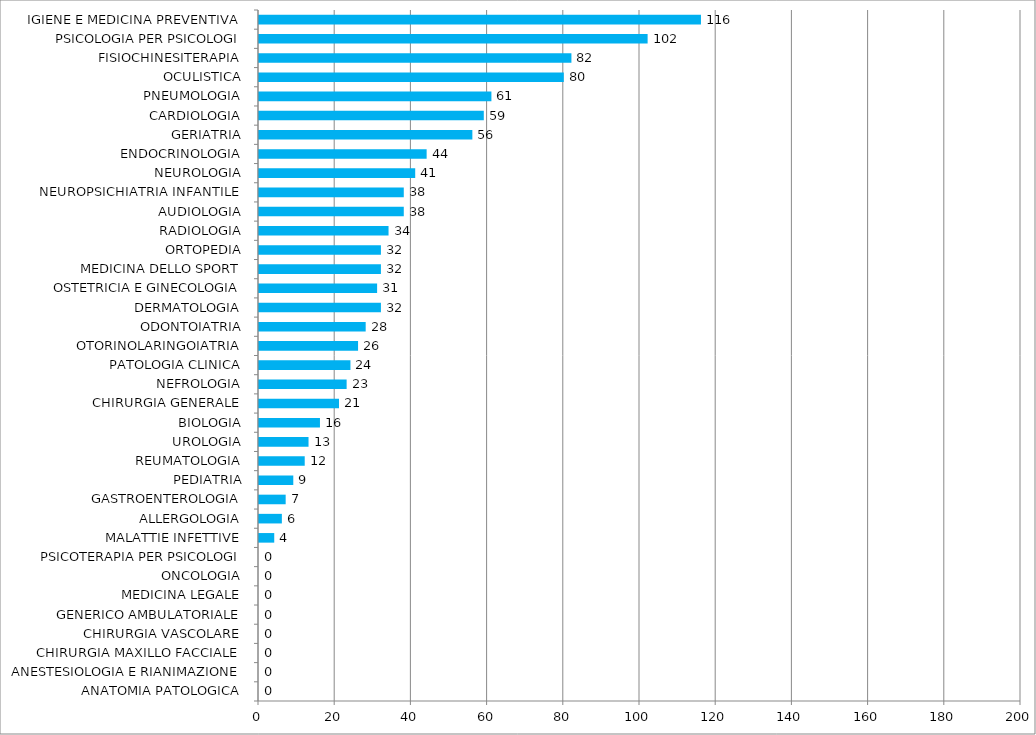
| Category | Series 0 |
|---|---|
| ANATOMIA PATOLOGICA | 0 |
| ANESTESIOLOGIA E RIANIMAZIONE | 0 |
| CHIRURGIA MAXILLO FACCIALE | 0 |
| CHIRURGIA VASCOLARE | 0 |
| GENERICO AMBULATORIALE | 0 |
| MEDICINA LEGALE | 0 |
| ONCOLOGIA | 0 |
| PSICOTERAPIA PER PSICOLOGI | 0 |
| MALATTIE INFETTIVE | 4 |
| ALLERGOLOGIA | 6 |
| GASTROENTEROLOGIA | 7 |
| PEDIATRIA | 9 |
| REUMATOLOGIA | 12 |
| UROLOGIA | 13 |
| BIOLOGIA | 16 |
| CHIRURGIA GENERALE | 21 |
| NEFROLOGIA | 23 |
| PATOLOGIA CLINICA | 24 |
| OTORINOLARINGOIATRIA | 26 |
| ODONTOIATRIA | 28 |
| DERMATOLOGIA | 32 |
| OSTETRICIA E GINECOLOGIA | 31 |
| MEDICINA DELLO SPORT | 32 |
| ORTOPEDIA | 32 |
| RADIOLOGIA | 34 |
| AUDIOLOGIA | 38 |
| NEUROPSICHIATRIA INFANTILE | 38 |
| NEUROLOGIA | 41 |
| ENDOCRINOLOGIA | 44 |
| GERIATRIA | 56 |
| CARDIOLOGIA | 59 |
| PNEUMOLOGIA | 61 |
| OCULISTICA | 80 |
| FISIOCHINESITERAPIA | 82 |
| PSICOLOGIA PER PSICOLOGI | 102 |
| IGIENE E MEDICINA PREVENTIVA | 116 |